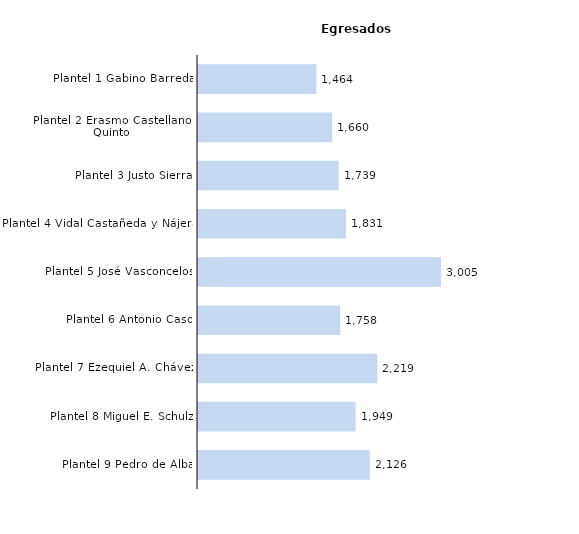
| Category | Series 0 |
|---|---|
| Plantel 9 Pedro de Alba | 2126 |
| Plantel 8 Miguel E. Schulz | 1949 |
| Plantel 7 Ezequiel A. Chávez | 2219 |
| Plantel 6 Antonio Caso | 1758 |
| Plantel 5 José Vasconcelos | 3005 |
| Plantel 4 Vidal Castañeda y Nájera | 1831 |
| Plantel 3 Justo Sierra | 1739 |
| Plantel 2 Erasmo Castellanos Quinto | 1660 |
| Plantel 1 Gabino Barreda | 1464 |